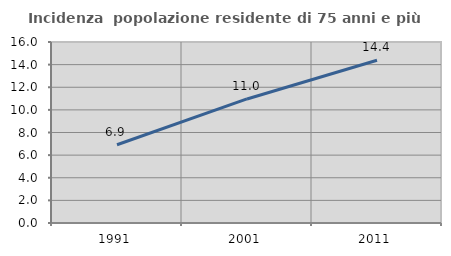
| Category | Incidenza  popolazione residente di 75 anni e più |
|---|---|
| 1991.0 | 6.918 |
| 2001.0 | 10.965 |
| 2011.0 | 14.384 |